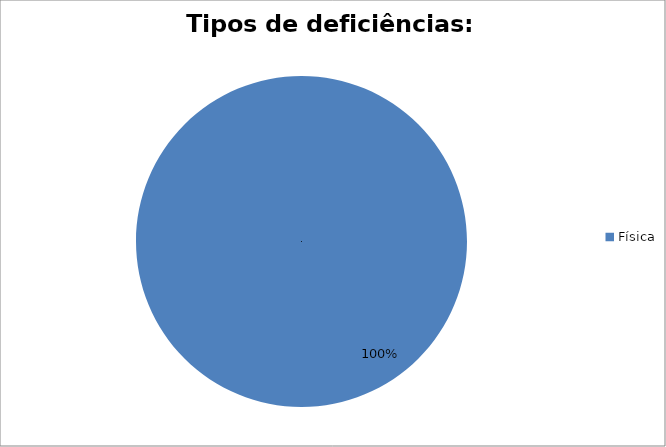
| Category | Tipos de deficiências: Quantitativo |
|---|---|
| Física | 1 |